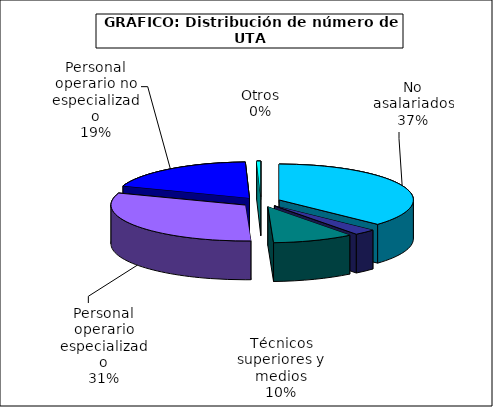
| Category | Series 0 |
|---|---|
| No asalariados | 2168.054 |
| Administrativos | 156.353 |
| Técnicos superiores y medios | 574.615 |
| Personal operario especializado | 1828.229 |
| Personal operario no especializado | 1121.922 |
| Otros | 28.51 |